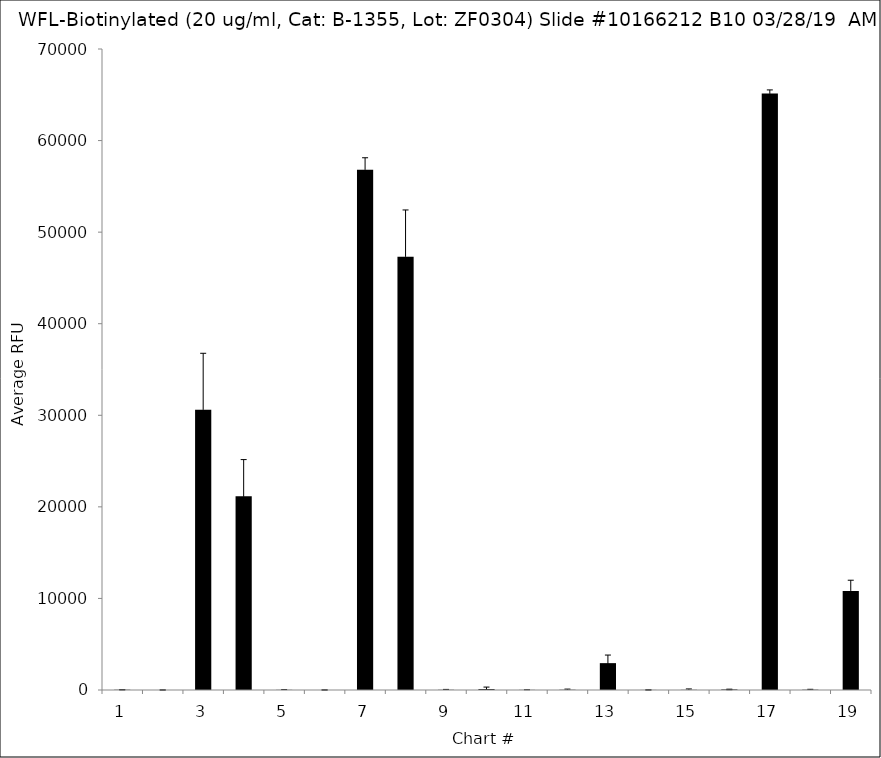
| Category | Series 0 |
|---|---|
| 1.0 | 24.5 |
| 2.0 | -0.5 |
| 3.0 | 30609.25 |
| 4.0 | 21155.75 |
| 5.0 | 15.25 |
| 6.0 | -1 |
| 7.0 | 56823 |
| 8.0 | 47299.5 |
| 9.0 | 20 |
| 10.0 | 99.75 |
| 11.0 | 12.75 |
| 12.0 | 25.25 |
| 13.0 | 2933.5 |
| 14.0 | 7.5 |
| 15.0 | 18.25 |
| 16.0 | 58.75 |
| 17.0 | 65139.5 |
| 18.0 | 29.75 |
| 19.0 | 10824.5 |